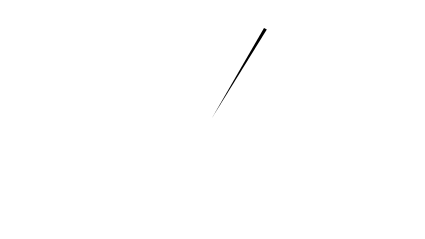
| Category | 299% |
|---|---|
| 0 | 66.667 |
| 1 | 1 |
| 2 | 132.333 |